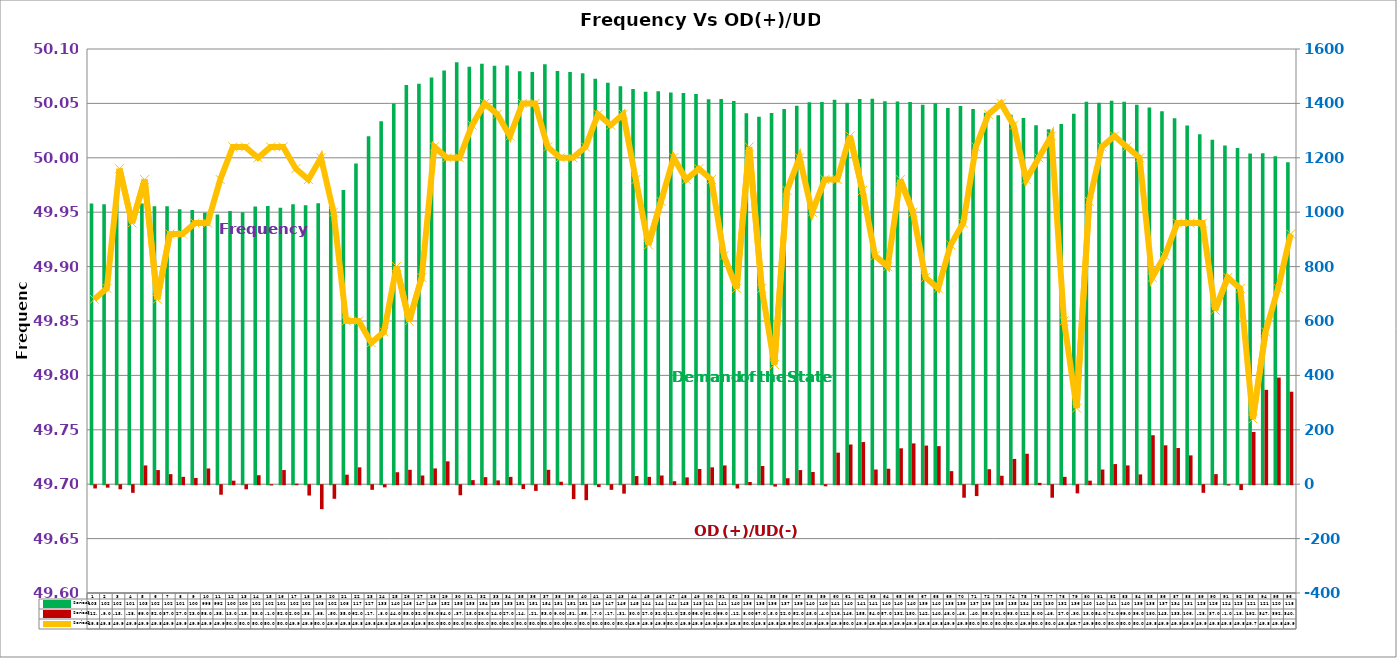
| Category | Series 2 | Series 4 |
|---|---|---|
| 0 | 1032 | -12 |
| 1 | 1029 | -9 |
| 2 | 1029 | -15 |
| 3 | 1013 | -28 |
| 4 | 1032 | 69 |
| 5 | 1022 | 52 |
| 6 | 1022 | 37 |
| 7 | 1011 | 27 |
| 8 | 1008 | 23 |
| 9 | 998 | 58 |
| 10 | 992 | -35 |
| 11 | 1004 | 13 |
| 12 | 1000 | -15 |
| 13 | 1021 | 33 |
| 14 | 1023 | -1 |
| 15 | 1016 | 52 |
| 16 | 1029 | 2 |
| 17 | 1026 | -38 |
| 18 | 1033 | -88 |
| 19 | 1029 | -50 |
| 20 | 1082 | 35 |
| 21 | 1179 | 62 |
| 22 | 1279 | -17 |
| 23 | 1334 | -8 |
| 24 | 1400 | 44 |
| 25 | 1468 | 53 |
| 26 | 1472 | 32 |
| 27 | 1495 | 58 |
| 28 | 1521 | 84 |
| 29 | 1551 | -37 |
| 30 | 1535 | 15 |
| 31 | 1546 | 26 |
| 32 | 1538 | 14 |
| 33 | 1539 | 27 |
| 34 | 1518 | -14 |
| 35 | 1515 | -21 |
| 36 | 1544 | 53 |
| 37 | 1519 | 9 |
| 38 | 1515 | -51 |
| 39 | 1511 | -55 |
| 40 | 1491 | -7 |
| 41 | 1476 | -17 |
| 42 | 1463 | -31 |
| 43 | 1453 | 30 |
| 44 | 1443 | 27 |
| 45 | 1445 | 32 |
| 46 | 1440 | 11 |
| 47 | 1438 | 25 |
| 48 | 1435 | 56 |
| 49 | 1415 | 62 |
| 50 | 1416 | 69 |
| 51 | 1409 | -12 |
| 52 | 1364 | 8 |
| 53 | 1351 | 67 |
| 54 | 1365 | -5 |
| 55 | 1379 | 22 |
| 56 | 1391 | 52 |
| 57 | 1404 | 45 |
| 58 | 1405 | -4 |
| 59 | 1413 | 116 |
| 60 | 1402 | 146 |
| 61 | 1416 | 155 |
| 62 | 1417 | 54 |
| 63 | 1408 | 57 |
| 64 | 1407 | 132 |
| 65 | 1405 | 150 |
| 66 | 1395 | 142 |
| 67 | 1401 | 140 |
| 68 | 1383 | 48 |
| 69 | 1390 | -46 |
| 70 | 1379 | -40 |
| 71 | 1366 | 55 |
| 72 | 1356 | 31 |
| 73 | 1358 | 93 |
| 74 | 1346 | 112 |
| 75 | 1320 | 5 |
| 76 | 1305 | -46 |
| 77 | 1324 | 27 |
| 78 | 1362 | -30 |
| 79 | 1406 | 13 |
| 80 | 1402 | 54 |
| 81 | 1410 | 74 |
| 82 | 1406 | 69 |
| 83 | 1395 | 36 |
| 84 | 1385 | 180 |
| 85 | 1371 | 143 |
| 86 | 1345 | 133 |
| 87 | 1319 | 106 |
| 88 | 1287 | -28 |
| 89 | 1266 | 37 |
| 90 | 1245 | -1 |
| 91 | 1236 | -18 |
| 92 | 1216 | 192 |
| 93 | 1217 | 347 |
| 94 | 1206 | 392 |
| 95 | 1184 | 340 |